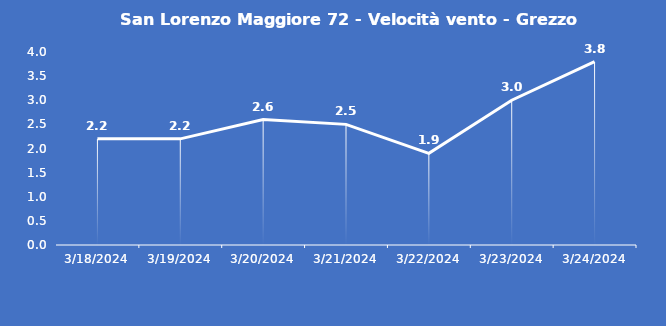
| Category | San Lorenzo Maggiore 72 - Velocità vento - Grezzo (m/s) |
|---|---|
| 3/18/24 | 2.2 |
| 3/19/24 | 2.2 |
| 3/20/24 | 2.6 |
| 3/21/24 | 2.5 |
| 3/22/24 | 1.9 |
| 3/23/24 | 3 |
| 3/24/24 | 3.8 |